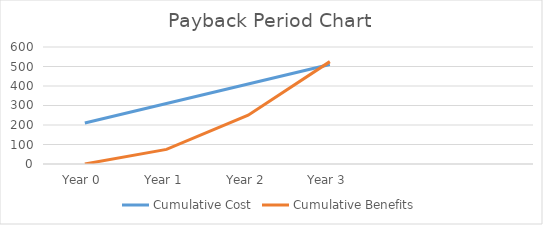
| Category | Cumulative Cost | Cumulative Benefits |
|---|---|---|
| Year 0 | 210 | 0 |
| Year 1 | 310 | 75 |
| Year 2 | 410 | 250 |
| Year 3 | 510 | 525 |